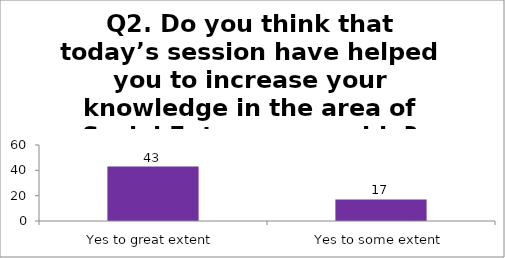
| Category | Q2. Do you think that today’s session have helped you to increase your knowledge in the area of Social Entrepreneurship? |
|---|---|
| Yes to great extent | 43 |
| Yes to some extent | 17 |